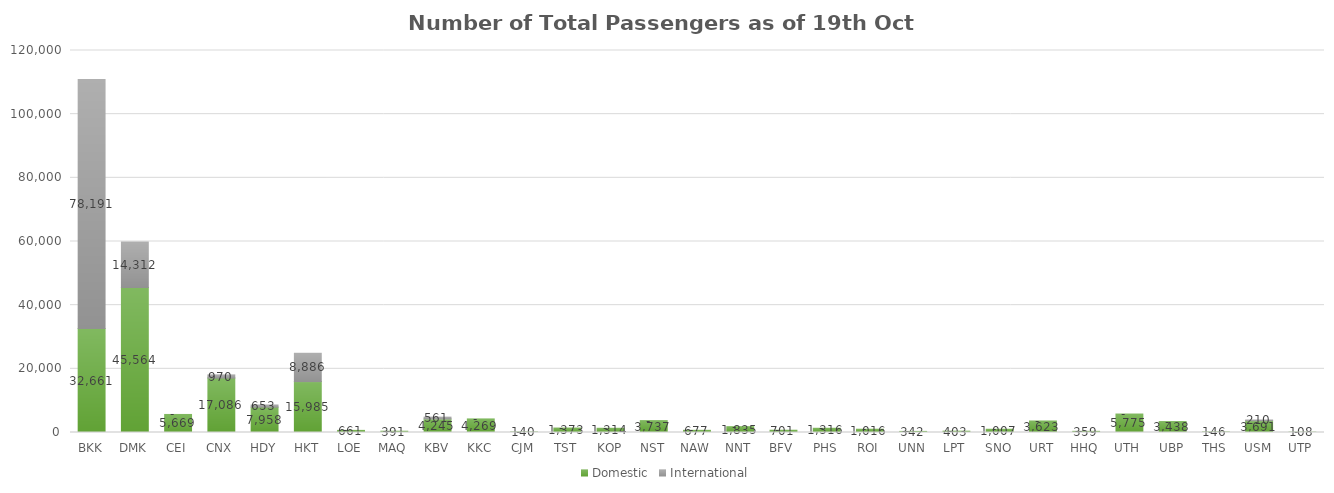
| Category | Domestic | International |
|---|---|---|
| BKK | 32661 | 78191 |
| DMK | 45564 | 14312 |
| CEI | 5669 | 0 |
| CNX | 17086 | 970 |
| HDY | 7958 | 653 |
| HKT | 15985 | 8886 |
| LOE | 661 | 0 |
| MAQ | 391 | 0 |
| KBV | 4245 | 561 |
| KKC | 4269 | 0 |
| CJM | 140 | 0 |
| TST | 1373 | 0 |
| KOP | 1314 | 0 |
| NST | 3737 | 0 |
| NAW | 677 | 0 |
| NNT | 1835 | 0 |
| BFV | 701 | 0 |
| PHS | 1316 | 0 |
| ROI | 1016 | 0 |
| UNN | 342 | 0 |
| LPT | 403 | 0 |
| SNO | 1007 | 0 |
| URT | 3623 | 0 |
| HHQ | 359 | 0 |
| UTH | 5775 | 0 |
| UBP | 3438 | 0 |
| THS | 146 | 0 |
| USM | 3691 | 210 |
| UTP | 108 | 0 |